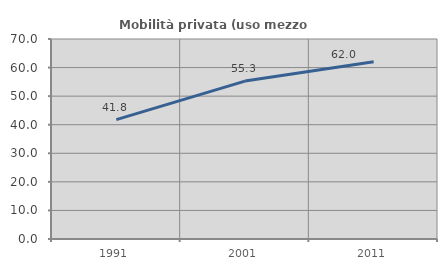
| Category | Mobilità privata (uso mezzo privato) |
|---|---|
| 1991.0 | 41.799 |
| 2001.0 | 55.263 |
| 2011.0 | 62.015 |